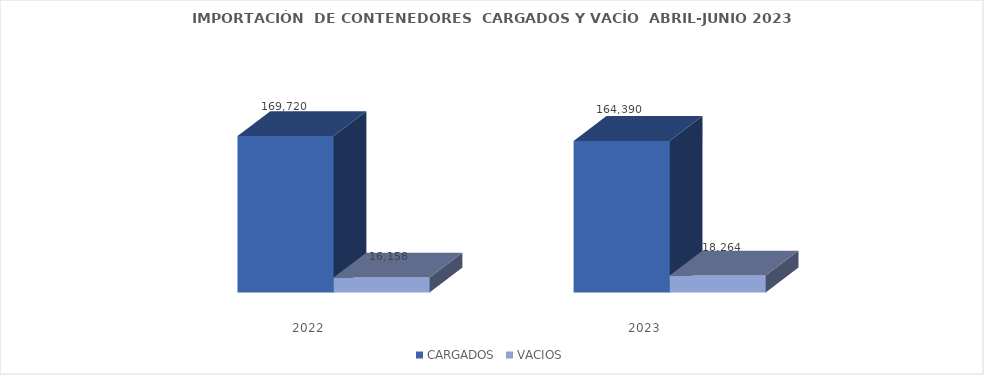
| Category | CARGADOS | VACIOS |
|---|---|---|
| 2022.0 | 169720 | 16158 |
| 2023.0 | 164389.75 | 18264.25 |